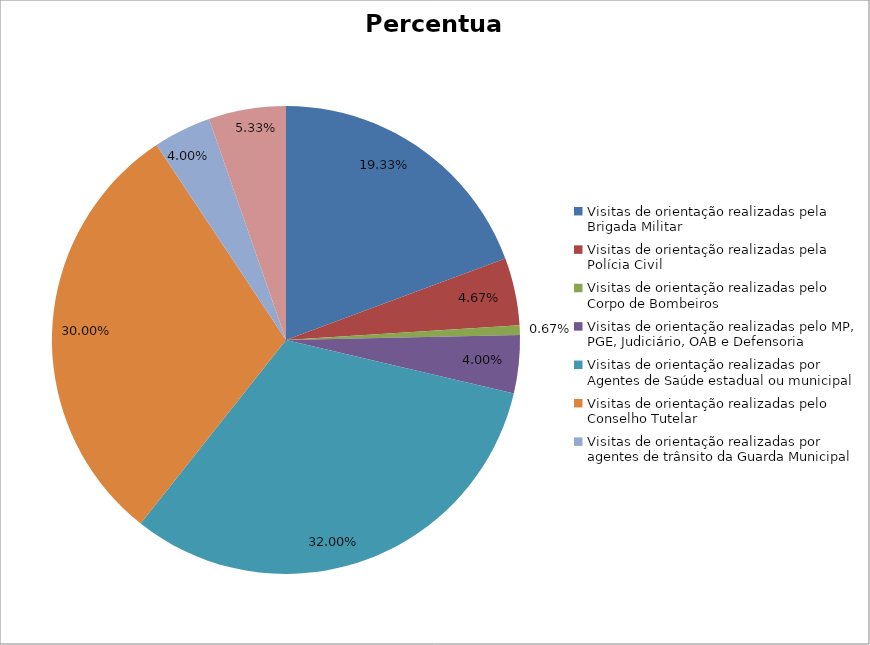
| Category | Percentual |
|---|---|
| Visitas de orientação realizadas pela Brigada Militar | 0.193 |
| Visitas de orientação realizadas pela Polícia Civil | 0.047 |
| Visitas de orientação realizadas pelo Corpo de Bombeiros | 0.007 |
| Visitas de orientação realizadas pelo MP, PGE, Judiciário, OAB e Defensoria | 0.04 |
| Visitas de orientação realizadas por Agentes de Saúde estadual ou municipal | 0.32 |
| Visitas de orientação realizadas pelo Conselho Tutelar | 0.3 |
| Visitas de orientação realizadas por agentes de trânsito da Guarda Municipal | 0.04 |
| Visitas de orientação realizadas por ONGs, entidades privadas, CRAS e CREAS | 0.053 |